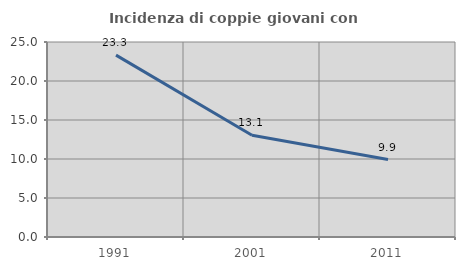
| Category | Incidenza di coppie giovani con figli |
|---|---|
| 1991.0 | 23.313 |
| 2001.0 | 13.052 |
| 2011.0 | 9.926 |